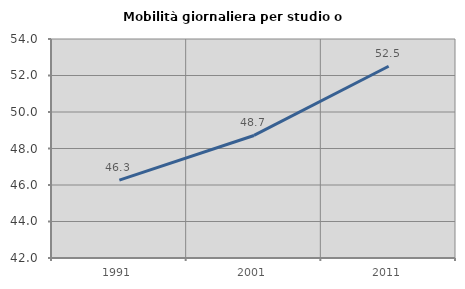
| Category | Mobilità giornaliera per studio o lavoro |
|---|---|
| 1991.0 | 46.269 |
| 2001.0 | 48.715 |
| 2011.0 | 52.508 |